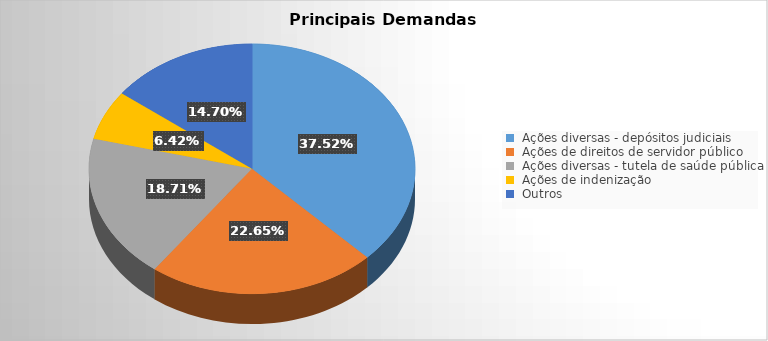
| Category | Series 0 |
|---|---|
| Ações diversas - depósitos judiciais | 6180000000 |
| Ações de direitos de servidor público | 3730133013.85 |
| Ações diversas - tutela de saúde pública | 3081164289.42 |
| Ações de indenização | 1058129702.47 |
| Outros | 2420881615.85 |